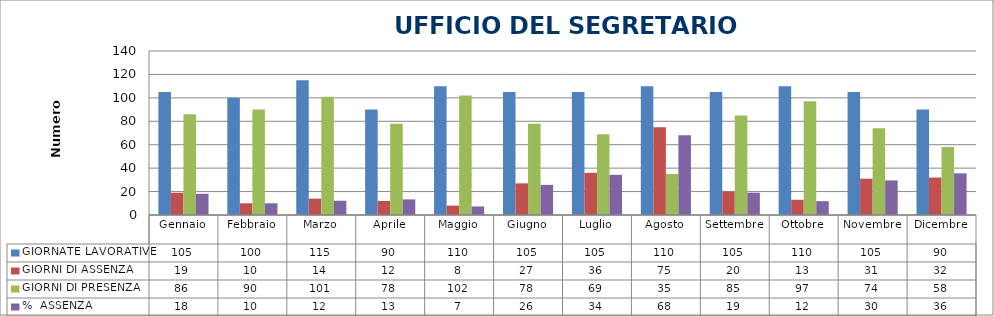
| Category | GIORNATE LAVORATIVE | GIORNI DI ASSENZA | GIORNI DI PRESENZA | %  ASSENZA |
|---|---|---|---|---|
| Gennaio | 105 | 19 | 86 | 18.095 |
| Febbraio | 100 | 10 | 90 | 10 |
| Marzo | 115 | 14 | 101 | 12.174 |
| Aprile | 90 | 12 | 78 | 13.333 |
| Maggio | 110 | 8 | 102 | 7.273 |
| Giugno | 105 | 27 | 78 | 25.714 |
| Luglio | 105 | 36 | 69 | 34.286 |
| Agosto | 110 | 75 | 35 | 68.182 |
| Settembre | 105 | 20 | 85 | 19.048 |
| Ottobre | 110 | 13 | 97 | 11.818 |
| Novembre | 105 | 31 | 74 | 29.524 |
| Dicembre | 90 | 32 | 58 | 35.556 |